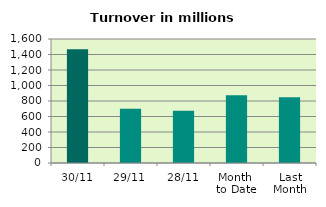
| Category | Series 0 |
|---|---|
| 30/11 | 1468.731 |
| 29/11 | 701.127 |
| 28/11 | 673.051 |
| Month 
to Date | 874.327 |
| Last
Month | 847.422 |